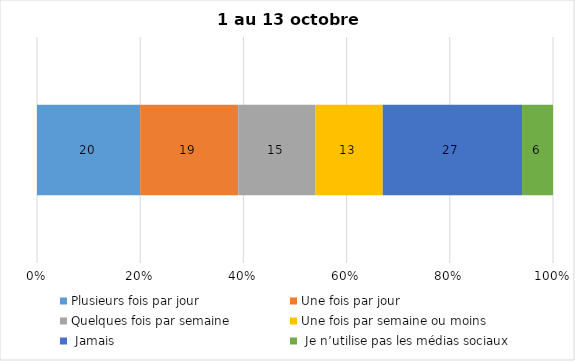
| Category | Plusieurs fois par jour | Une fois par jour | Quelques fois par semaine   | Une fois par semaine ou moins   |  Jamais   |  Je n’utilise pas les médias sociaux |
|---|---|---|---|---|---|---|
| 0 | 20 | 19 | 15 | 13 | 27 | 6 |